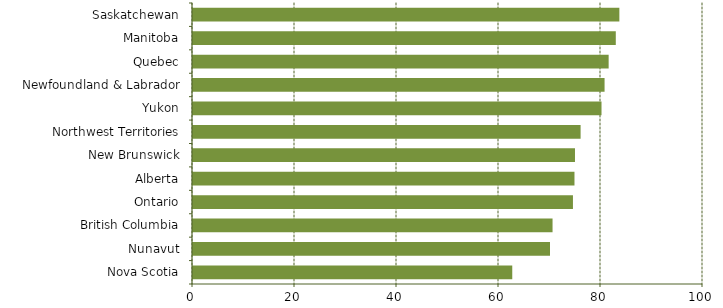
| Category | Investment Attractiveness |
|---|---|
| Nova Scotia | 62.6 |
| Nunavut | 70 |
| British Columbia | 70.5 |
| Ontario | 74.5 |
| Alberta | 74.8 |
| New Brunswick | 74.9 |
| Northwest Territories | 76 |
| Yukon | 80.1 |
| Newfoundland & Labrador | 80.7 |
| Quebec | 81.5 |
| Manitoba | 82.9 |
| Saskatchewan | 83.6 |